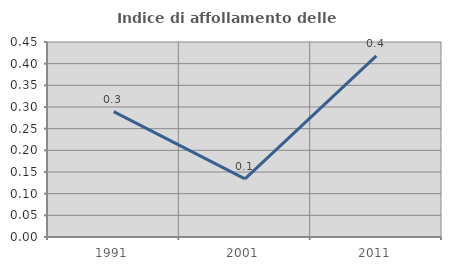
| Category | Indice di affollamento delle abitazioni  |
|---|---|
| 1991.0 | 0.289 |
| 2001.0 | 0.134 |
| 2011.0 | 0.418 |